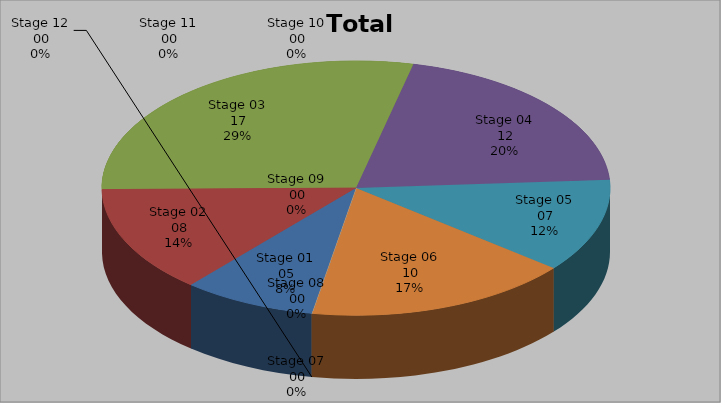
| Category | Series 0 |
|---|---|
| Stage 01 | 5 |
| Stage 02 | 8 |
| Stage 03 | 17 |
| Stage 04 | 12 |
| Stage 05 | 7 |
| Stage 06 | 10 |
| Stage 07 | 0 |
| Stage 08 | 0 |
| Stage 09 | 0 |
| Stage 10 | 0 |
| Stage 11 | 0 |
| Stage 12 | 0 |